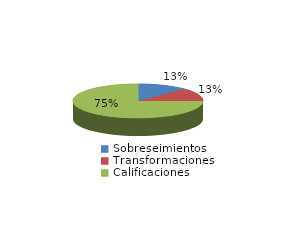
| Category | Series 0 |
|---|---|
| Sobreseimientos | 998 |
| Transformaciones | 990 |
| Calificaciones | 5907 |